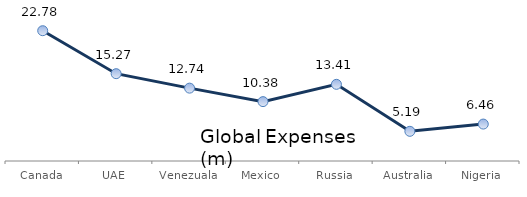
| Category | Exp CY |
|---|---|
| Canada | 22.781 |
| UAE | 15.267 |
| Venezuala | 12.74 |
| Mexico | 10.383 |
| Russia | 13.407 |
| Australia | 5.192 |
| Nigeria | 6.455 |